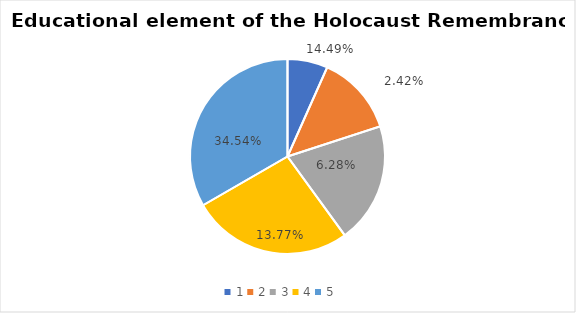
| Category | Series 0 | Series 1 |
|---|---|---|
| 0 | 1 | 0.145 |
| 1 | 2 | 0.024 |
| 2 | 3 | 0.063 |
| 3 | 4 | 0.138 |
| 4 | 5 | 0.345 |